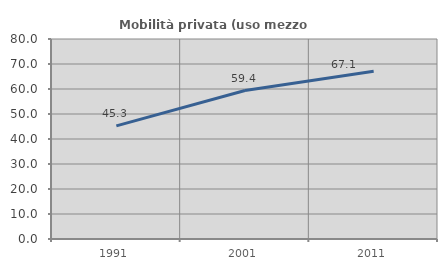
| Category | Mobilità privata (uso mezzo privato) |
|---|---|
| 1991.0 | 45.25 |
| 2001.0 | 59.394 |
| 2011.0 | 67.076 |